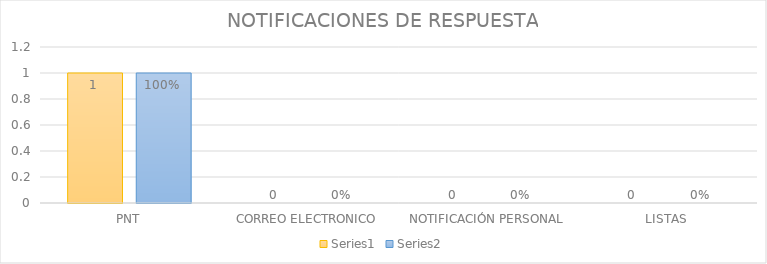
| Category | Series 3 | Series 4 |
|---|---|---|
| PNT | 1 | 1 |
| CORREO ELECTRONICO | 0 | 0 |
| NOTIFICACIÓN PERSONAL | 0 | 0 |
| LISTAS | 0 | 0 |